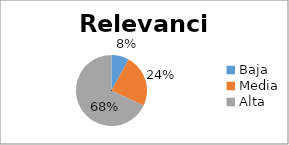
| Category | N° DOC |
|---|---|
| Baja | 2 |
| Media | 6 |
| Alta | 17 |